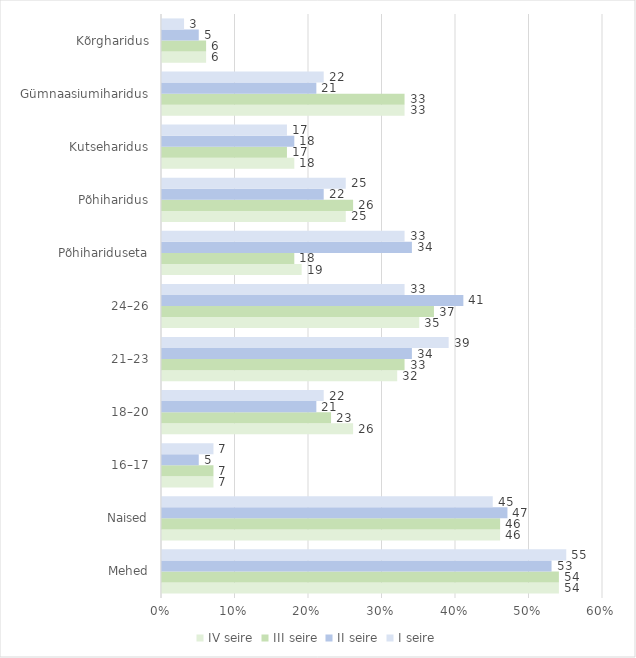
| Category | IV seire | III seire | II seire | I seire |
|---|---|---|---|---|
| Mehed | 54 | 54 | 53 | 55 |
| Naised | 46 | 46 | 47 | 45 |
| 16–17 | 7 | 7 | 5 | 7 |
| 18–20 | 26 | 23 | 21 | 22 |
| 21–23 | 32 | 33 | 34 | 39 |
| 24–26 | 35 | 37 | 41 | 33 |
| Põhihariduseta | 19 | 18 | 34 | 33 |
| Põhiharidus | 25 | 26 | 22 | 25 |
| Kutseharidus | 18 | 17 | 18 | 17 |
| Gümnaasiumiharidus | 33 | 33 | 21 | 22 |
| Kõrgharidus | 6 | 6 | 5 | 3 |